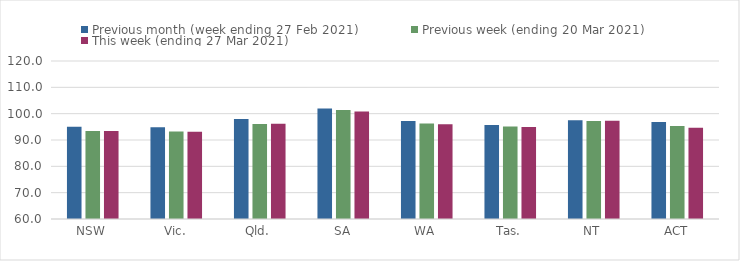
| Category | Previous month (week ending 27 Feb 2021) | Previous week (ending 20 Mar 2021) | This week (ending 27 Mar 2021) |
|---|---|---|---|
| NSW | 95.07 | 93.4 | 93.4 |
| Vic. | 94.85 | 93.26 | 93.14 |
| Qld. | 97.96 | 96.06 | 96.21 |
| SA | 101.95 | 101.39 | 100.81 |
| WA | 97.19 | 96.28 | 96.02 |
| Tas. | 95.7 | 95.16 | 94.96 |
| NT | 97.46 | 97.24 | 97.33 |
| ACT | 96.88 | 95.28 | 94.65 |